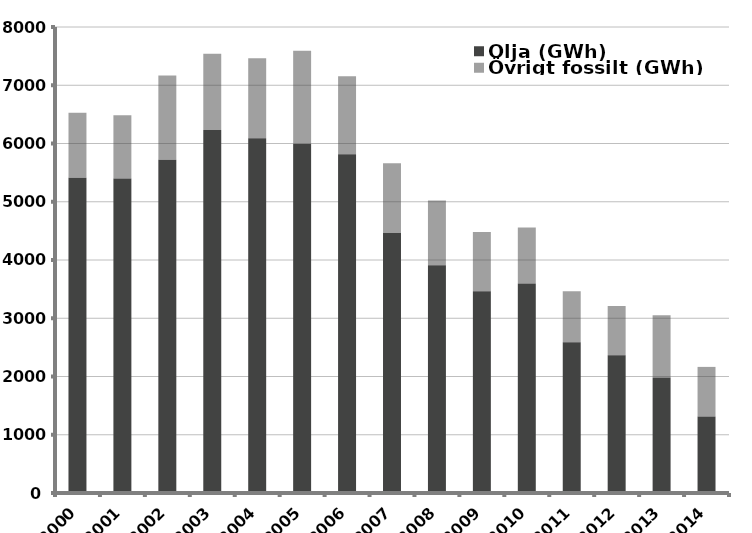
| Category | Olja (GWh) | Övrigt fossilt (GWh) |
|---|---|---|
| 2000.0 | 5412 | 1118 |
| 2001.0 | 5401 | 1082 |
| 2002.0 | 5719 | 1450 |
| 2003.0 | 6233 | 1307 |
| 2004.0 | 6088 | 1374 |
| 2005.0 | 5990 | 1604 |
| 2006.0 | 5816 | 1340 |
| 2007.0 | 4463 | 1197 |
| 2008.0 | 3910 | 1112 |
| 2009.0 | 3462 | 1018 |
| 2010.0 | 3597 | 959 |
| 2011.0 | 2588 | 875 |
| 2012.0 | 2364 | 846 |
| 2013.0 | 1983 | 1068 |
| 2014.0 | 1314 | 851 |